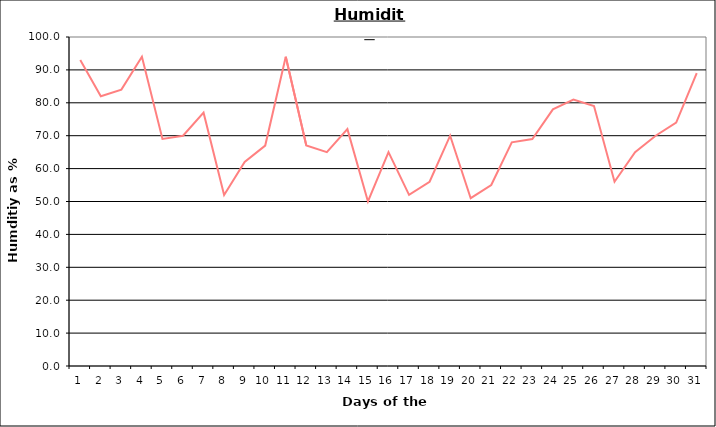
| Category | Series 0 |
|---|---|
| 0 | 93 |
| 1 | 82 |
| 2 | 84 |
| 3 | 94 |
| 4 | 69 |
| 5 | 70 |
| 6 | 77 |
| 7 | 52 |
| 8 | 62 |
| 9 | 67 |
| 10 | 94 |
| 11 | 67 |
| 12 | 65 |
| 13 | 72 |
| 14 | 50 |
| 15 | 65 |
| 16 | 52 |
| 17 | 56 |
| 18 | 70 |
| 19 | 51 |
| 20 | 55 |
| 21 | 68 |
| 22 | 69 |
| 23 | 78 |
| 24 | 81 |
| 25 | 79 |
| 26 | 56 |
| 27 | 65 |
| 28 | 70 |
| 29 | 74 |
| 30 | 89 |